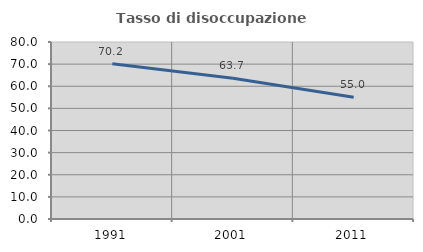
| Category | Tasso di disoccupazione giovanile  |
|---|---|
| 1991.0 | 70.219 |
| 2001.0 | 63.662 |
| 2011.0 | 55.005 |